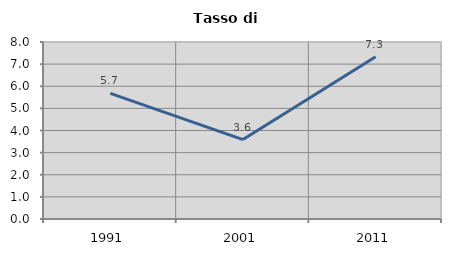
| Category | Tasso di disoccupazione   |
|---|---|
| 1991.0 | 5.678 |
| 2001.0 | 3.591 |
| 2011.0 | 7.331 |